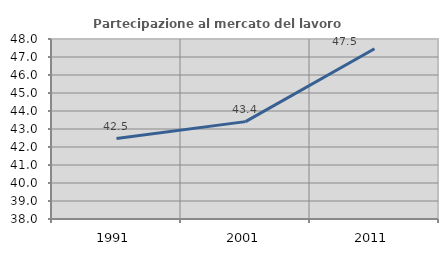
| Category | Partecipazione al mercato del lavoro  femminile |
|---|---|
| 1991.0 | 42.471 |
| 2001.0 | 43.41 |
| 2011.0 | 47.455 |